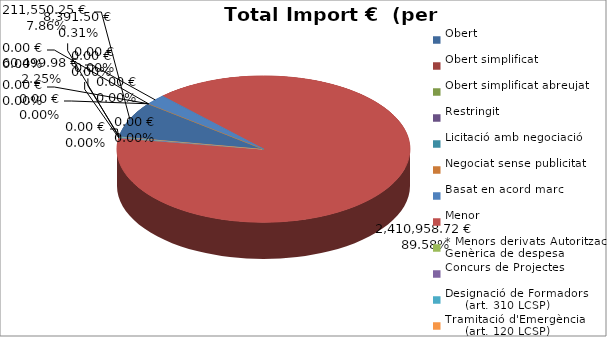
| Category | Total preu
(amb IVA) |
|---|---|
| Obert | 211550.25 |
| Obert simplificat | 0 |
| Obert simplificat abreujat | 0 |
| Restringit | 0 |
| Licitació amb negociació | 0 |
| Negociat sense publicitat | 0 |
| Basat en acord marc | 60499.98 |
| Menor | 2410958.72 |
| * Menors derivats Autorització Genèrica de despesa | 0 |
| Concurs de Projectes | 0 |
| Designació de Formadors
     (art. 310 LCSP) | 8391.5 |
| Tramitació d'Emergència
     (art. 120 LCSP) | 0 |